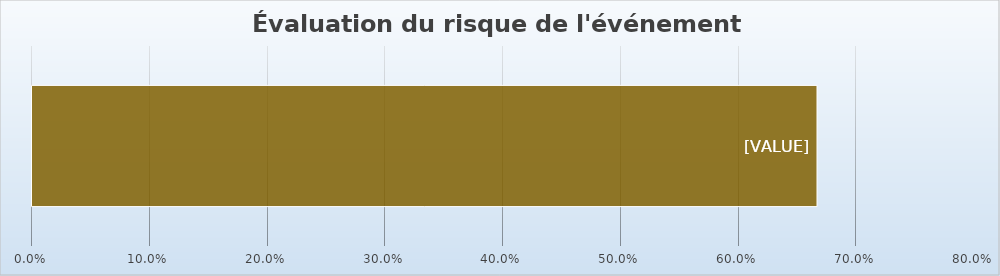
| Category | Series 0 |
|---|---|
| 0 | 0.667 |